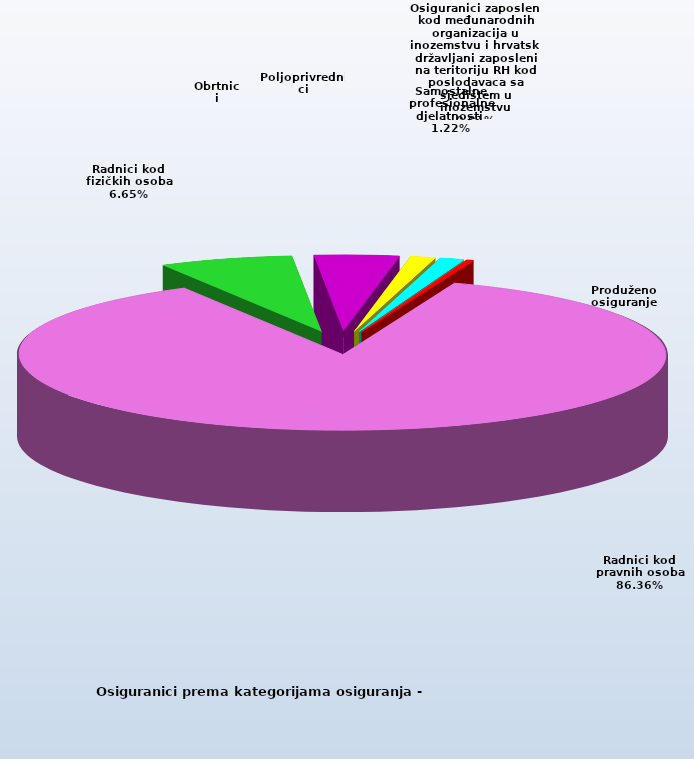
| Category | Series 0 |
|---|---|
| Radnici kod pravnih osoba | 1334374 |
| Radnici kod fizičkih osoba | 102691 |
| Obrtnici | 64998 |
| Poljoprivrednici | 19213 |
| Samostalne profesionalne djelatnosti  | 18813 |
| Osiguranici zaposleni kod međunarodnih organizacija u inozemstvu i hrvatski državljani zaposleni na teritoriju RH kod poslodavaca sa sjedištem u inozemstvu | 81 |
| Produženo osiguranje | 5022 |